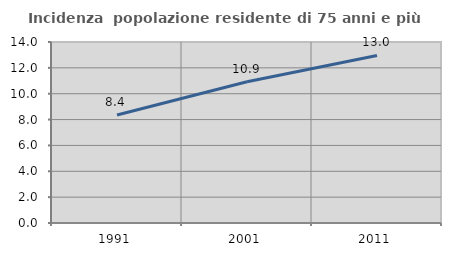
| Category | Incidenza  popolazione residente di 75 anni e più |
|---|---|
| 1991.0 | 8.355 |
| 2001.0 | 10.921 |
| 2011.0 | 12.959 |